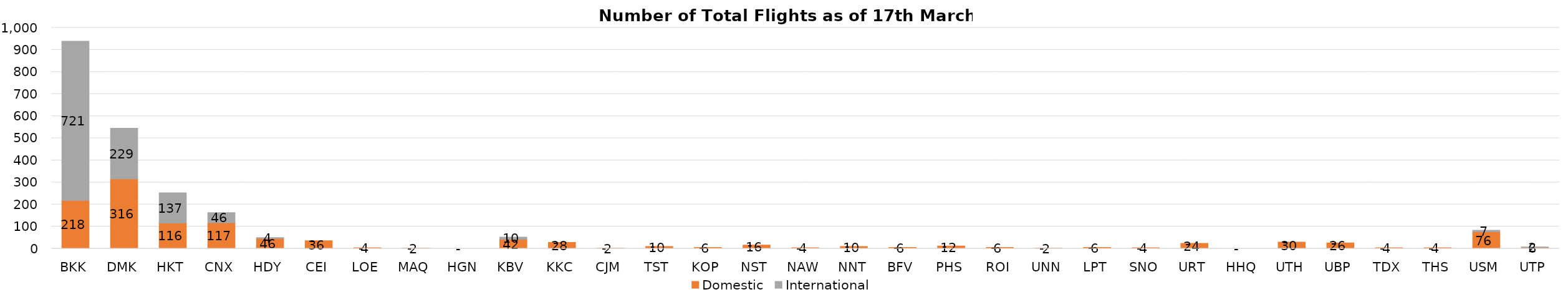
| Category | Domestic | International |
|---|---|---|
| BKK | 218 | 721 |
| DMK | 316 | 229 |
| HKT | 116 | 137 |
| CNX | 117 | 46 |
| HDY | 46 | 4 |
| CEI | 36 | 0 |
| LOE | 4 | 0 |
| MAQ | 2 | 0 |
| HGN | 0 | 0 |
| KBV | 42 | 10 |
| KKC | 28 | 0 |
| CJM | 2 | 0 |
| TST | 10 | 0 |
| KOP | 6 | 0 |
| NST | 16 | 0 |
| NAW | 4 | 0 |
| NNT | 10 | 0 |
| BFV | 6 | 0 |
| PHS | 12 | 0 |
| ROI | 6 | 0 |
| UNN | 2 | 0 |
| LPT | 6 | 0 |
| SNO | 4 | 0 |
| URT | 24 | 0 |
| HHQ | 0 | 0 |
| UTH | 30 | 0 |
| UBP | 26 | 0 |
| TDX | 4 | 0 |
| THS | 4 | 0 |
| USM | 76 | 7 |
| UTP | 6 | 2 |